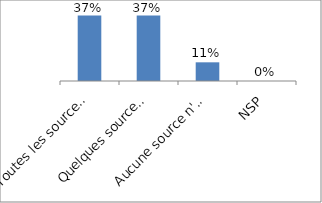
| Category | Series 0 |
|---|---|
| Toutes les sources sont identifiées individuellement | 0.368 |
| Quelques sources sont identifiées | 0.368 |
| Aucune source n'est identifiée | 0.105 |
| NSP | 0 |